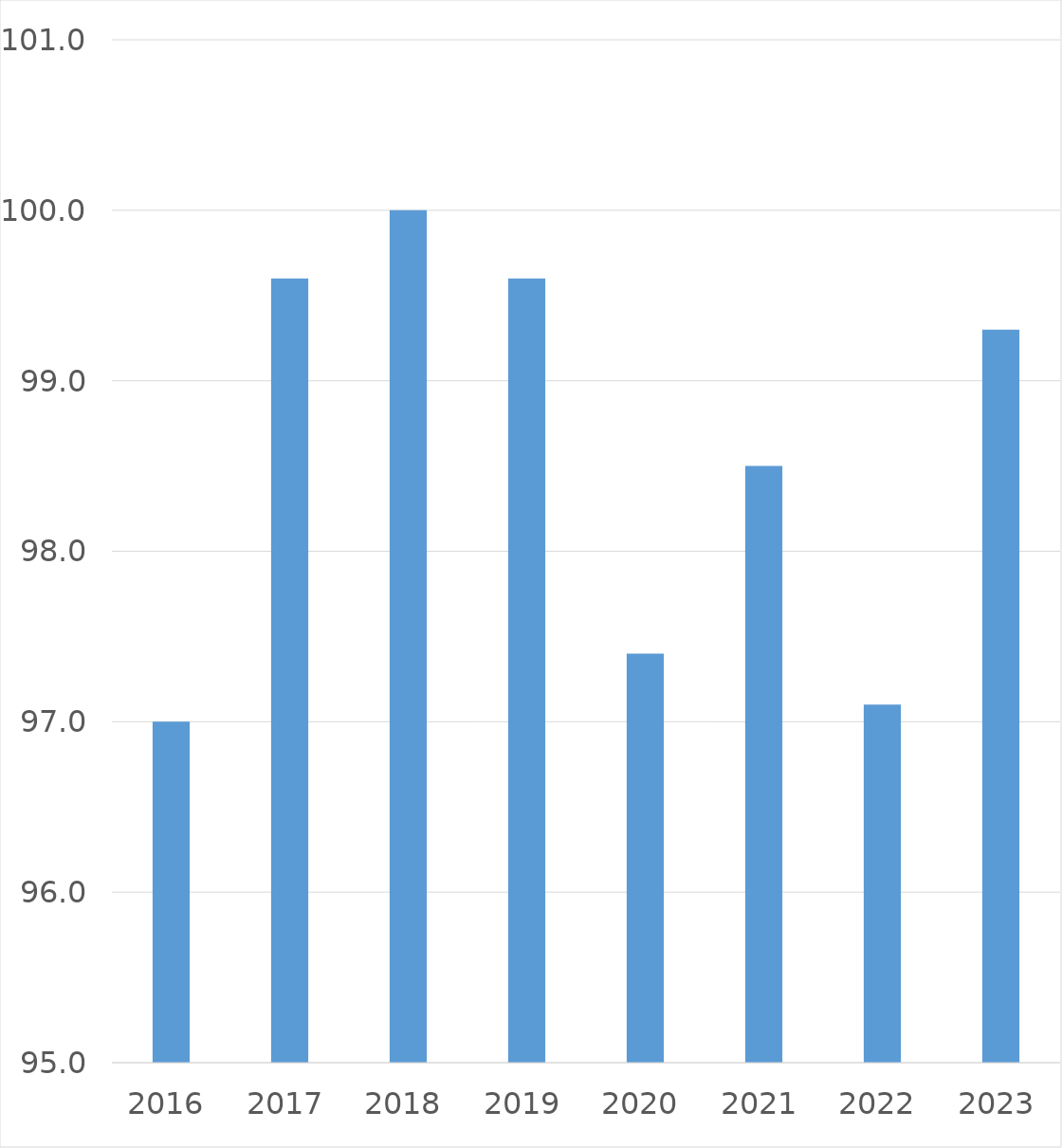
| Category | Series 0 |
|---|---|
| 2016 | 97 |
| 2017 | 99.6 |
| 2018 | 100 |
| 2019 | 99.6 |
| 2020 | 97.4 |
| 2021 | 98.5 |
| 2022 | 97.1 |
| 2023 | 99.3 |